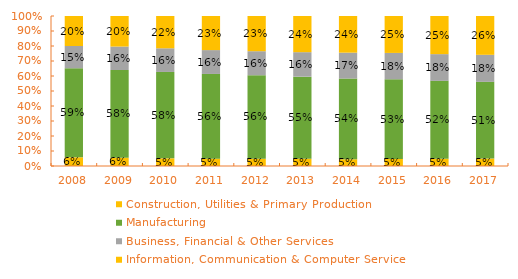
| Category | Construction, Utilities & Primary Production  | Manufacturing  | Business, Financial & Other Services | Information, Communication & Computer Services |
|---|---|---|---|---|
| 2008.0 | 0.058 | 0.594 | 0.148 | 0.2 |
| 2009.0 | 0.055 | 0.585 | 0.156 | 0.204 |
| 2010.0 | 0.051 | 0.576 | 0.158 | 0.215 |
| 2011.0 | 0.049 | 0.565 | 0.159 | 0.227 |
| 2012.0 | 0.049 | 0.557 | 0.16 | 0.235 |
| 2013.0 | 0.048 | 0.547 | 0.163 | 0.241 |
| 2014.0 | 0.045 | 0.538 | 0.172 | 0.244 |
| 2015.0 | 0.047 | 0.531 | 0.176 | 0.246 |
| 2016.0 | 0.048 | 0.519 | 0.178 | 0.254 |
| 2017.0 | 0.05 | 0.511 | 0.18 | 0.259 |